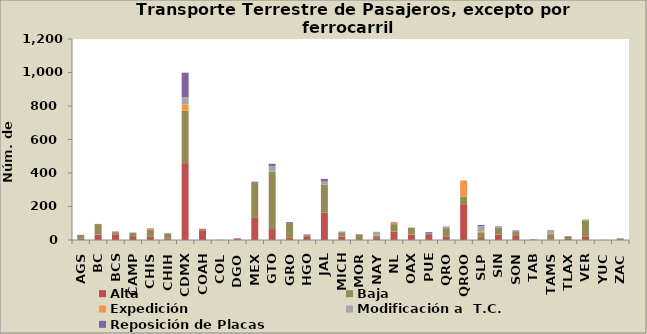
| Category | Alta                                         | Baja | Expedición | Modificación a  T.C. | Reposición de Placas |
|---|---|---|---|---|---|
| AGS | 7 | 24 | 0 | 0 | 0 |
| BC | 32 | 63 | 0 | 0 | 1 |
| BCS | 34 | 13 | 1 | 3 | 1 |
| CAMP | 18 | 26 | 1 | 0 | 0 |
| CHIS | 19 | 45 | 5 | 0 | 2 |
| CHIH | 10 | 30 | 0 | 0 | 0 |
| CDMX | 459 | 312 | 38 | 44 | 146 |
| COAH | 58 | 8 | 0 | 0 | 1 |
| COL | 1 | 0 | 0 | 0 | 0 |
| DGO | 8 | 4 | 0 | 0 | 0 |
| MEX | 132 | 210 | 0 | 0 | 6 |
| GTO | 65 | 342 | 0 | 33 | 15 |
| GRO | 13 | 89 | 0 | 0 | 5 |
| HGO | 18 | 8 | 0 | 0 | 7 |
| JAL | 163 | 167 | 0 | 19 | 16 |
| MICH | 20 | 26 | 0 | 0 | 4 |
| MOR | 0 | 34 | 0 | 0 | 0 |
| NAY | 17 | 7 | 1 | 24 | 0 |
| NL | 51 | 44 | 9 | 1 | 3 |
| OAX | 33 | 41 | 0 | 0 | 0 |
| PUE | 30 | 8 | 0 | 0 | 9 |
| QRO | 19 | 52 | 1 | 6 | 2 |
| QROO | 214 | 44 | 96 | 1 | 1 |
| SLP | 12 | 34 | 3 | 34 | 7 |
| SIN | 33 | 41 | 0 | 2 | 5 |
| SON | 24 | 25 | 1 | 0 | 7 |
| TAB | 1 | 3 | 0 | 1 | 0 |
| TAMS | 3 | 32 | 2 | 23 | 0 |
| TLAX | 6 | 13 | 0 | 0 | 4 |
| VER | 19 | 98 | 0 | 5 | 1 |
| YUC | 0 | 1 | 0 | 0 | 0 |
| ZAC | 0 | 10 | 0 | 0 | 0 |